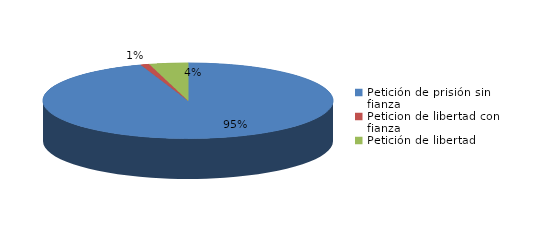
| Category | Series 0 |
|---|---|
| Petición de prisión sin fianza | 485 |
| Peticion de libertad con fianza | 5 |
| Petición de libertad | 22 |